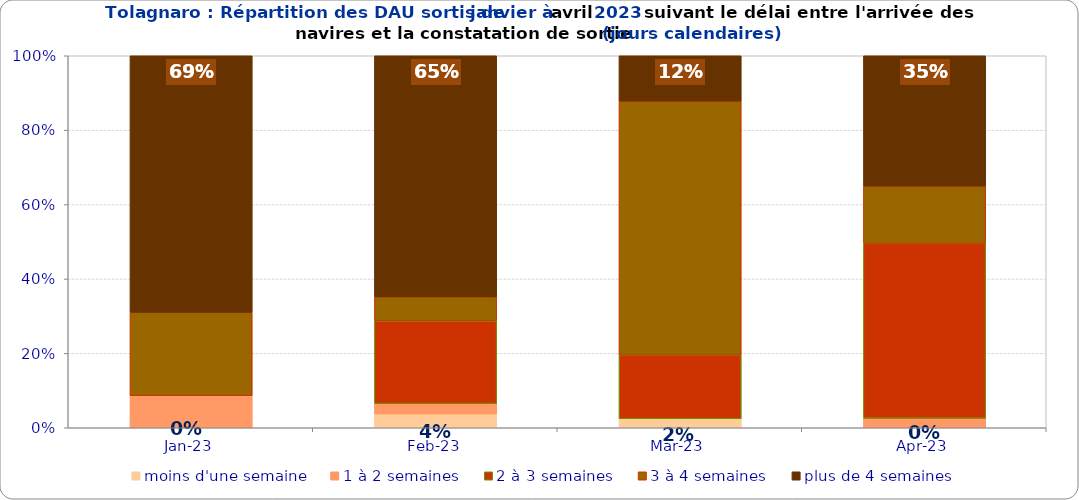
| Category | moins d'une semaine | 1 à 2 semaines | 2 à 3 semaines | 3 à 4 semaines | plus de 4 semaines |
|---|---|---|---|---|---|
| 2023-01-01 | 0 | 0.086 | 0 | 0.224 | 0.69 |
| 2023-02-01 | 0.037 | 0.028 | 0.222 | 0.065 | 0.648 |
| 2023-03-01 | 0.024 | 0 | 0.171 | 0.683 | 0.122 |
| 2023-04-01 | 0 | 0.026 | 0.47 | 0.154 | 0.35 |